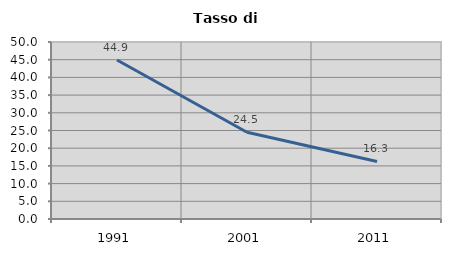
| Category | Tasso di disoccupazione   |
|---|---|
| 1991.0 | 44.898 |
| 2001.0 | 24.5 |
| 2011.0 | 16.268 |